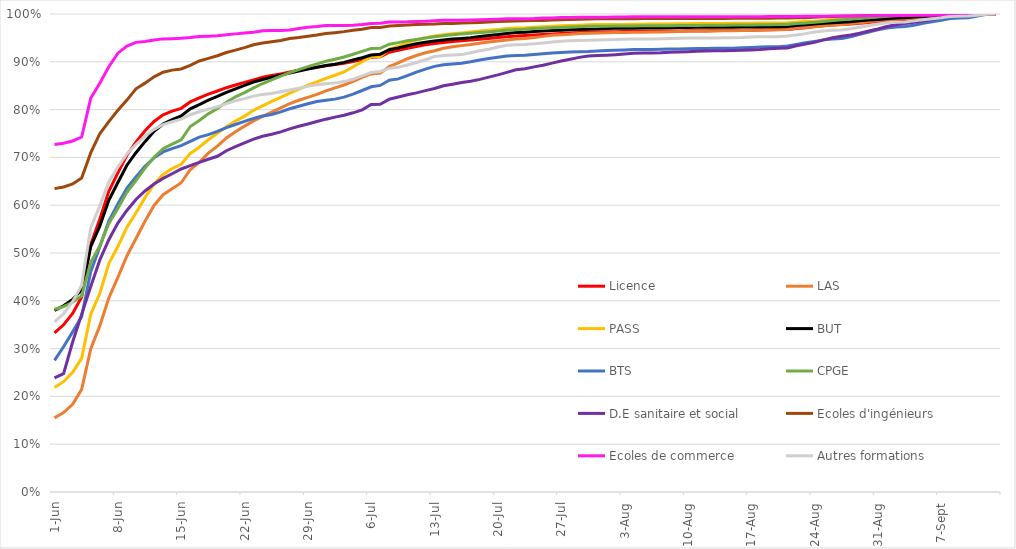
| Category | Licence | LAS | PASS | BUT | BTS | CPGE | D.E sanitaire et social | Ecoles d'ingénieurs | Ecoles de commerce | Autres formations |
|---|---|---|---|---|---|---|---|---|---|---|
| 2023-06-01 | 0.333 | 0.155 | 0.219 | 0.38 | 0.276 | 0.382 | 0.239 | 0.635 | 0.727 | 0.356 |
| 2023-06-02 | 0.35 | 0.166 | 0.231 | 0.39 | 0.304 | 0.388 | 0.248 | 0.638 | 0.73 | 0.373 |
| 2023-06-03 | 0.374 | 0.183 | 0.25 | 0.403 | 0.335 | 0.397 | 0.314 | 0.644 | 0.734 | 0.398 |
| 2023-06-04 | 0.408 | 0.215 | 0.28 | 0.423 | 0.367 | 0.41 | 0.372 | 0.657 | 0.743 | 0.433 |
| 2023-06-05 | 0.518 | 0.299 | 0.372 | 0.513 | 0.461 | 0.48 | 0.43 | 0.709 | 0.824 | 0.553 |
| 2023-06-06 | 0.571 | 0.348 | 0.415 | 0.556 | 0.513 | 0.515 | 0.485 | 0.75 | 0.855 | 0.598 |
| 2023-06-07 | 0.629 | 0.406 | 0.478 | 0.61 | 0.567 | 0.562 | 0.528 | 0.775 | 0.89 | 0.649 |
| 2023-06-08 | 0.668 | 0.449 | 0.514 | 0.647 | 0.603 | 0.593 | 0.562 | 0.798 | 0.918 | 0.68 |
| 2023-06-09 | 0.705 | 0.494 | 0.554 | 0.684 | 0.636 | 0.627 | 0.589 | 0.82 | 0.933 | 0.707 |
| 2023-06-10 | 0.732 | 0.53 | 0.584 | 0.71 | 0.659 | 0.652 | 0.612 | 0.844 | 0.941 | 0.727 |
| 2023-06-11 | 0.756 | 0.566 | 0.616 | 0.733 | 0.681 | 0.678 | 0.63 | 0.855 | 0.942 | 0.744 |
| 2023-06-12 | 0.775 | 0.599 | 0.644 | 0.755 | 0.699 | 0.7 | 0.644 | 0.869 | 0.946 | 0.759 |
| 2023-06-13 | 0.789 | 0.622 | 0.664 | 0.77 | 0.711 | 0.718 | 0.656 | 0.878 | 0.948 | 0.769 |
| 2023-06-14 | 0.797 | 0.635 | 0.677 | 0.779 | 0.718 | 0.728 | 0.666 | 0.883 | 0.948 | 0.775 |
| 2023-06-15 | 0.803 | 0.647 | 0.686 | 0.787 | 0.725 | 0.737 | 0.676 | 0.885 | 0.949 | 0.78 |
| 2023-06-16 | 0.816 | 0.674 | 0.708 | 0.802 | 0.734 | 0.765 | 0.683 | 0.893 | 0.951 | 0.789 |
| 2023-06-17 | 0.825 | 0.69 | 0.721 | 0.811 | 0.742 | 0.777 | 0.69 | 0.902 | 0.953 | 0.795 |
| 2023-06-18 | 0.833 | 0.709 | 0.737 | 0.82 | 0.748 | 0.791 | 0.696 | 0.907 | 0.954 | 0.801 |
| 2023-06-19 | 0.839 | 0.724 | 0.75 | 0.827 | 0.754 | 0.802 | 0.702 | 0.913 | 0.954 | 0.806 |
| 2023-06-20 | 0.846 | 0.741 | 0.764 | 0.836 | 0.762 | 0.815 | 0.714 | 0.919 | 0.956 | 0.812 |
| 2023-06-21 | 0.851 | 0.754 | 0.776 | 0.843 | 0.769 | 0.827 | 0.722 | 0.925 | 0.958 | 0.819 |
| 2023-06-22 | 0.857 | 0.765 | 0.786 | 0.851 | 0.775 | 0.836 | 0.731 | 0.93 | 0.96 | 0.823 |
| 2023-06-23 | 0.862 | 0.776 | 0.799 | 0.858 | 0.782 | 0.846 | 0.738 | 0.936 | 0.962 | 0.828 |
| 2023-06-24 | 0.868 | 0.786 | 0.808 | 0.863 | 0.786 | 0.855 | 0.744 | 0.939 | 0.965 | 0.832 |
| 2023-06-25 | 0.871 | 0.795 | 0.817 | 0.868 | 0.79 | 0.862 | 0.749 | 0.942 | 0.965 | 0.834 |
| 2023-06-26 | 0.875 | 0.804 | 0.825 | 0.872 | 0.795 | 0.87 | 0.753 | 0.944 | 0.966 | 0.838 |
| 2023-06-27 | 0.879 | 0.813 | 0.834 | 0.876 | 0.802 | 0.878 | 0.76 | 0.949 | 0.966 | 0.841 |
| 2023-06-28 | 0.882 | 0.82 | 0.843 | 0.881 | 0.807 | 0.884 | 0.765 | 0.951 | 0.97 | 0.845 |
| 2023-06-29 | 0.885 | 0.826 | 0.851 | 0.885 | 0.812 | 0.89 | 0.77 | 0.953 | 0.972 | 0.849 |
| 2023-06-30 | 0.888 | 0.832 | 0.858 | 0.889 | 0.817 | 0.896 | 0.775 | 0.956 | 0.974 | 0.852 |
| 2023-07-01 | 0.892 | 0.839 | 0.865 | 0.892 | 0.82 | 0.901 | 0.78 | 0.959 | 0.976 | 0.854 |
| 2023-07-02 | 0.894 | 0.846 | 0.872 | 0.895 | 0.822 | 0.905 | 0.784 | 0.961 | 0.976 | 0.856 |
| 2023-07-03 | 0.897 | 0.851 | 0.879 | 0.899 | 0.826 | 0.91 | 0.788 | 0.963 | 0.976 | 0.859 |
| 2023-07-04 | 0.901 | 0.859 | 0.89 | 0.904 | 0.832 | 0.916 | 0.793 | 0.966 | 0.977 | 0.863 |
| 2023-07-05 | 0.905 | 0.867 | 0.9 | 0.909 | 0.84 | 0.922 | 0.8 | 0.968 | 0.978 | 0.871 |
| 2023-07-06 | 0.909 | 0.875 | 0.911 | 0.914 | 0.848 | 0.928 | 0.811 | 0.972 | 0.98 | 0.877 |
| 2023-07-07 | 0.91 | 0.876 | 0.911 | 0.916 | 0.851 | 0.928 | 0.811 | 0.972 | 0.981 | 0.88 |
| 2023-07-08 | 0.92 | 0.89 | 0.926 | 0.925 | 0.861 | 0.937 | 0.822 | 0.975 | 0.983 | 0.886 |
| 2023-07-09 | 0.924 | 0.898 | 0.932 | 0.929 | 0.864 | 0.94 | 0.826 | 0.976 | 0.984 | 0.889 |
| 2023-07-10 | 0.928 | 0.906 | 0.94 | 0.934 | 0.871 | 0.944 | 0.831 | 0.977 | 0.984 | 0.893 |
| 2023-07-11 | 0.932 | 0.913 | 0.945 | 0.938 | 0.878 | 0.947 | 0.835 | 0.978 | 0.984 | 0.899 |
| 2023-07-12 | 0.935 | 0.919 | 0.95 | 0.941 | 0.885 | 0.95 | 0.84 | 0.979 | 0.985 | 0.904 |
| 2023-07-13 | 0.938 | 0.923 | 0.954 | 0.944 | 0.89 | 0.952 | 0.844 | 0.979 | 0.986 | 0.911 |
| 2023-07-14 | 0.94 | 0.928 | 0.957 | 0.946 | 0.894 | 0.955 | 0.85 | 0.98 | 0.987 | 0.913 |
| 2023-07-15 | 0.942 | 0.931 | 0.959 | 0.947 | 0.896 | 0.957 | 0.853 | 0.98 | 0.987 | 0.914 |
| 2023-07-16 | 0.944 | 0.934 | 0.961 | 0.949 | 0.897 | 0.958 | 0.857 | 0.981 | 0.987 | 0.915 |
| 2023-07-17 | 0.946 | 0.936 | 0.962 | 0.951 | 0.9 | 0.96 | 0.859 | 0.982 | 0.987 | 0.919 |
| 2023-07-18 | 0.947 | 0.939 | 0.964 | 0.953 | 0.904 | 0.961 | 0.863 | 0.982 | 0.988 | 0.923 |
| 2023-07-19 | 0.949 | 0.942 | 0.966 | 0.955 | 0.907 | 0.963 | 0.868 | 0.983 | 0.988 | 0.926 |
| 2023-07-20 | 0.951 | 0.944 | 0.968 | 0.957 | 0.91 | 0.964 | 0.873 | 0.984 | 0.989 | 0.931 |
| 2023-07-21 | 0.952 | 0.946 | 0.97 | 0.959 | 0.912 | 0.966 | 0.878 | 0.985 | 0.99 | 0.935 |
| 2023-07-22 | 0.954 | 0.948 | 0.971 | 0.961 | 0.913 | 0.967 | 0.883 | 0.986 | 0.99 | 0.936 |
| 2023-07-23 | 0.955 | 0.949 | 0.971 | 0.962 | 0.914 | 0.968 | 0.885 | 0.986 | 0.99 | 0.936 |
| 2023-07-24 | 0.956 | 0.951 | 0.972 | 0.963 | 0.915 | 0.969 | 0.889 | 0.986 | 0.99 | 0.938 |
| 2023-07-25 | 0.957 | 0.953 | 0.973 | 0.965 | 0.917 | 0.97 | 0.893 | 0.987 | 0.992 | 0.939 |
| 2023-07-26 | 0.958 | 0.955 | 0.974 | 0.965 | 0.918 | 0.971 | 0.897 | 0.987 | 0.992 | 0.941 |
| 2023-07-27 | 0.959 | 0.957 | 0.975 | 0.966 | 0.92 | 0.972 | 0.902 | 0.988 | 0.993 | 0.943 |
| 2023-07-28 | 0.96 | 0.958 | 0.976 | 0.967 | 0.921 | 0.973 | 0.905 | 0.989 | 0.993 | 0.944 |
| 2023-07-29 | 0.961 | 0.959 | 0.977 | 0.968 | 0.921 | 0.974 | 0.909 | 0.989 | 0.993 | 0.945 |
| 2023-07-30 | 0.962 | 0.96 | 0.977 | 0.968 | 0.922 | 0.974 | 0.912 | 0.99 | 0.993 | 0.945 |
| 2023-07-31 | 0.962 | 0.96 | 0.978 | 0.969 | 0.922 | 0.974 | 0.913 | 0.99 | 0.993 | 0.946 |
| 2023-08-01 | 0.963 | 0.961 | 0.978 | 0.97 | 0.924 | 0.975 | 0.914 | 0.99 | 0.993 | 0.946 |
| 2023-08-02 | 0.963 | 0.961 | 0.978 | 0.97 | 0.924 | 0.975 | 0.915 | 0.99 | 0.994 | 0.946 |
| 2023-08-03 | 0.963 | 0.961 | 0.978 | 0.97 | 0.925 | 0.975 | 0.916 | 0.99 | 0.994 | 0.947 |
| 2023-08-04 | 0.964 | 0.962 | 0.978 | 0.97 | 0.925 | 0.975 | 0.918 | 0.99 | 0.994 | 0.948 |
| 2023-08-05 | 0.964 | 0.962 | 0.979 | 0.971 | 0.926 | 0.975 | 0.918 | 0.99 | 0.994 | 0.948 |
| 2023-08-06 | 0.964 | 0.962 | 0.979 | 0.971 | 0.926 | 0.975 | 0.919 | 0.99 | 0.994 | 0.948 |
| 2023-08-07 | 0.964 | 0.963 | 0.979 | 0.971 | 0.926 | 0.975 | 0.919 | 0.991 | 0.994 | 0.948 |
| 2023-08-08 | 0.964 | 0.963 | 0.979 | 0.971 | 0.927 | 0.976 | 0.92 | 0.991 | 0.994 | 0.949 |
| 2023-08-09 | 0.965 | 0.963 | 0.98 | 0.972 | 0.927 | 0.976 | 0.921 | 0.991 | 0.994 | 0.949 |
| 2023-08-10 | 0.965 | 0.964 | 0.98 | 0.972 | 0.927 | 0.976 | 0.921 | 0.991 | 0.994 | 0.95 |
| 2023-08-11 | 0.965 | 0.964 | 0.98 | 0.972 | 0.928 | 0.976 | 0.922 | 0.991 | 0.994 | 0.95 |
| 2023-08-12 | 0.965 | 0.964 | 0.98 | 0.972 | 0.928 | 0.976 | 0.923 | 0.991 | 0.994 | 0.95 |
| 2023-08-13 | 0.965 | 0.964 | 0.98 | 0.972 | 0.928 | 0.976 | 0.923 | 0.991 | 0.994 | 0.95 |
| 2023-08-14 | 0.966 | 0.965 | 0.98 | 0.972 | 0.928 | 0.977 | 0.923 | 0.991 | 0.994 | 0.95 |
| 2023-08-15 | 0.966 | 0.965 | 0.98 | 0.972 | 0.929 | 0.977 | 0.924 | 0.991 | 0.994 | 0.95 |
| 2023-08-16 | 0.966 | 0.965 | 0.981 | 0.973 | 0.929 | 0.977 | 0.924 | 0.991 | 0.994 | 0.951 |
| 2023-08-17 | 0.966 | 0.966 | 0.981 | 0.973 | 0.93 | 0.977 | 0.925 | 0.991 | 0.994 | 0.952 |
| 2023-08-18 | 0.967 | 0.966 | 0.981 | 0.973 | 0.931 | 0.977 | 0.926 | 0.991 | 0.994 | 0.952 |
| 2023-08-19 | 0.967 | 0.967 | 0.981 | 0.973 | 0.931 | 0.978 | 0.927 | 0.991 | 0.995 | 0.952 |
| 2023-08-20 | 0.967 | 0.967 | 0.981 | 0.973 | 0.932 | 0.978 | 0.928 | 0.991 | 0.995 | 0.953 |
| 2023-08-21 | 0.968 | 0.968 | 0.982 | 0.974 | 0.933 | 0.978 | 0.929 | 0.992 | 0.995 | 0.954 |
| 2023-08-22 | 0.97 | 0.97 | 0.983 | 0.976 | 0.936 | 0.98 | 0.934 | 0.992 | 0.995 | 0.956 |
| 2023-08-23 | 0.971 | 0.972 | 0.984 | 0.978 | 0.94 | 0.981 | 0.937 | 0.992 | 0.995 | 0.959 |
| 2023-08-24 | 0.974 | 0.973 | 0.985 | 0.979 | 0.943 | 0.983 | 0.941 | 0.993 | 0.995 | 0.962 |
| 2023-08-25 | 0.975 | 0.975 | 0.987 | 0.981 | 0.946 | 0.984 | 0.946 | 0.994 | 0.996 | 0.965 |
| 2023-08-26 | 0.977 | 0.977 | 0.988 | 0.982 | 0.948 | 0.987 | 0.95 | 0.995 | 0.996 | 0.966 |
| 2023-08-27 | 0.978 | 0.978 | 0.989 | 0.983 | 0.949 | 0.988 | 0.953 | 0.995 | 0.996 | 0.966 |
| 2023-08-28 | 0.979 | 0.98 | 0.99 | 0.984 | 0.952 | 0.99 | 0.956 | 0.996 | 0.996 | 0.969 |
| 2023-08-29 | 0.981 | 0.982 | 0.992 | 0.986 | 0.957 | 0.991 | 0.96 | 0.996 | 0.996 | 0.972 |
| 2023-08-30 | 0.982 | 0.984 | 0.993 | 0.987 | 0.962 | 0.992 | 0.965 | 0.997 | 0.996 | 0.976 |
| 2023-08-31 | 0.984 | 0.986 | 0.995 | 0.989 | 0.967 | 0.994 | 0.969 | 0.998 | 0.997 | 0.979 |
| 2023-09-01 | 0.985 | 0.988 | 0.996 | 0.99 | 0.971 | 0.995 | 0.974 | 0.998 | 0.997 | 0.982 |
| 2023-09-02 | 0.987 | 0.989 | 0.996 | 0.991 | 0.973 | 0.996 | 0.978 | 0.998 | 0.997 | 0.983 |
| 2023-09-03 | 0.988 | 0.99 | 0.997 | 0.992 | 0.974 | 0.997 | 0.98 | 0.999 | 0.997 | 0.983 |
| 2023-09-04 | 0.989 | 0.992 | 0.998 | 0.994 | 0.977 | 0.998 | 0.983 | 0.999 | 0.997 | 0.986 |
| 2023-09-05 | 0.99 | 0.993 | 0.998 | 0.995 | 0.981 | 0.999 | 0.986 | 0.999 | 0.998 | 0.988 |
| 2023-09-06 | 0.992 | 0.994 | 0.999 | 0.996 | 0.984 | 0.999 | 0.989 | 0.999 | 0.998 | 0.99 |
| 2023-09-07 | 0.993 | 0.995 | 0.999 | 0.997 | 0.987 | 0.999 | 0.992 | 0.999 | 0.998 | 0.992 |
| 2023-09-08 | 0.995 | 0.996 | 0.999 | 0.998 | 0.991 | 0.999 | 0.996 | 1 | 0.999 | 0.995 |
| 2023-09-09 | 0.996 | 0.997 | 0.999 | 0.998 | 0.992 | 0.999 | 0.996 | 1 | 0.999 | 0.995 |
| 2023-09-10 | 0.997 | 0.997 | 0.999 | 0.998 | 0.992 | 0.999 | 0.997 | 1 | 0.999 | 0.996 |
| 2023-09-11 | 0.998 | 0.998 | 1 | 0.999 | 0.996 | 1 | 0.999 | 1 | 0.999 | 0.997 |
| 2023-09-12 | 1 | 1 | 1 | 1 | 0.999 | 1 | 1 | 1 | 1 | 1 |
| 2023-09-13 | 1 | 1 | 1 | 1 | 1 | 1 | 1 | 1 | 1 | 1 |